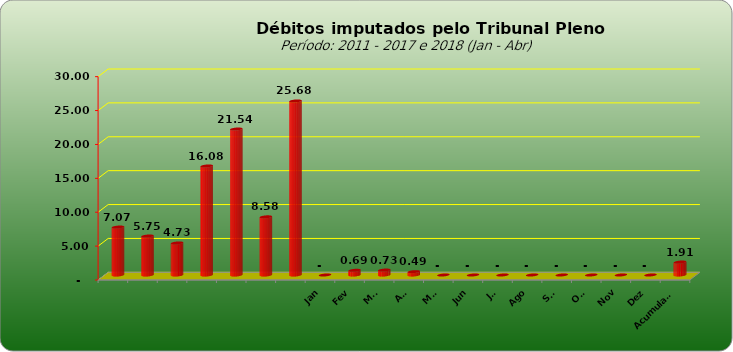
| Category |  7.073.154,74  |
|---|---|
|  | 7073154.74 |
|  | 5749129.25 |
|  | 4727033.51 |
|  | 16081820.48 |
|  | 21535723.6 |
|  | 8578266.09 |
|  | 25676499.17 |
| Jan | 0 |
| Fev | 689867.86 |
| Mar | 729624.1 |
| Abr | 491509.68 |
| Mai | 0 |
| Jun | 0 |
| Jul | 0 |
| Ago | 0 |
| Set | 0 |
| Out | 0 |
| Nov | 0 |
| Dez | 0 |
| Acumulado | 1911001.64 |